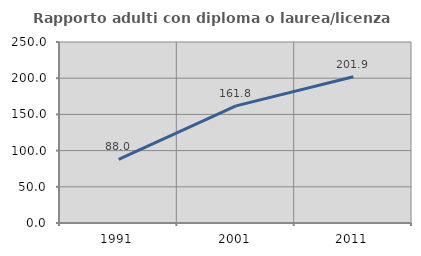
| Category | Rapporto adulti con diploma o laurea/licenza media  |
|---|---|
| 1991.0 | 88 |
| 2001.0 | 161.785 |
| 2011.0 | 201.905 |